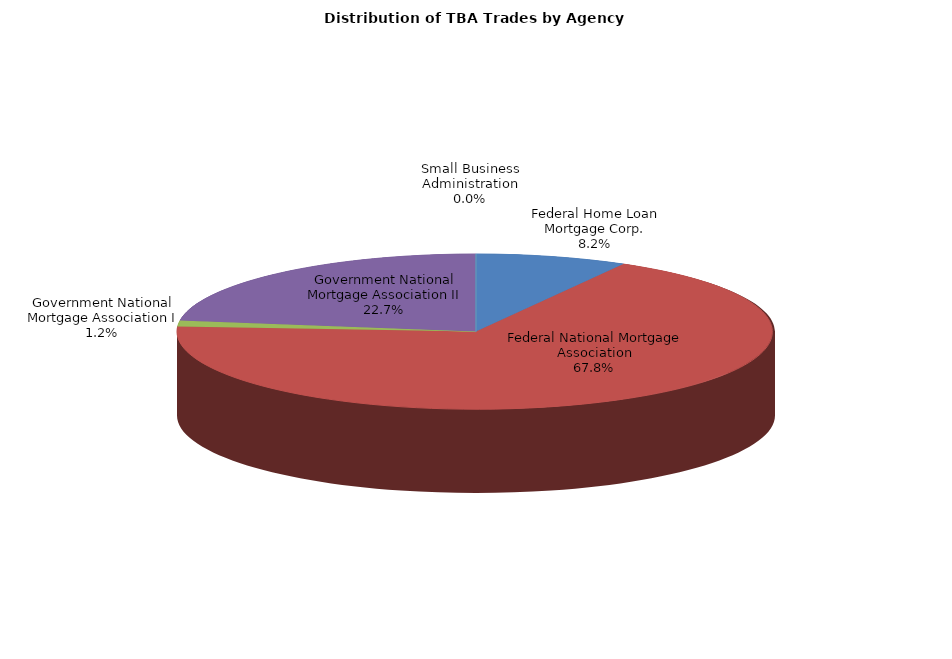
| Category | Series 0 |
|---|---|
| Federal Home Loan Mortgage Corp. | 583.378 |
| Federal National Mortgage Association | 4823.442 |
| Government National Mortgage Association I | 88.06 |
| Government National Mortgage Association II | 1614.418 |
| Small Business Administration | 0 |